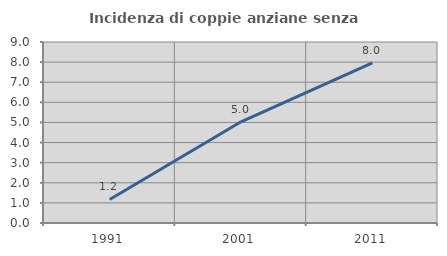
| Category | Incidenza di coppie anziane senza figli  |
|---|---|
| 1991.0 | 1.172 |
| 2001.0 | 5.034 |
| 2011.0 | 7.962 |